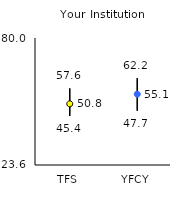
| Category | 25th | 75th | Mean |
|---|---|---|---|
| TFS | 45.4 | 57.6 | 50.76 |
| YFCY | 47.7 | 62.2 | 55.05 |